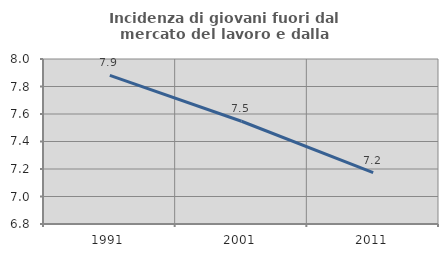
| Category | Incidenza di giovani fuori dal mercato del lavoro e dalla formazione  |
|---|---|
| 1991.0 | 7.88 |
| 2001.0 | 7.547 |
| 2011.0 | 7.173 |